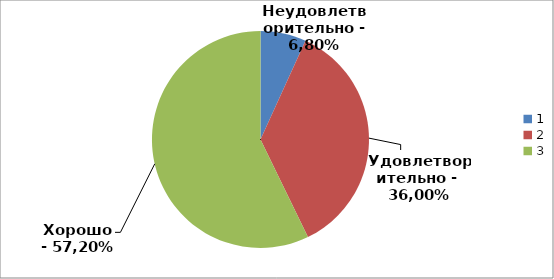
| Category | Series 0 |
|---|---|
| 0 | 0.068 |
| 1 | 0.36 |
| 2 | 0.572 |